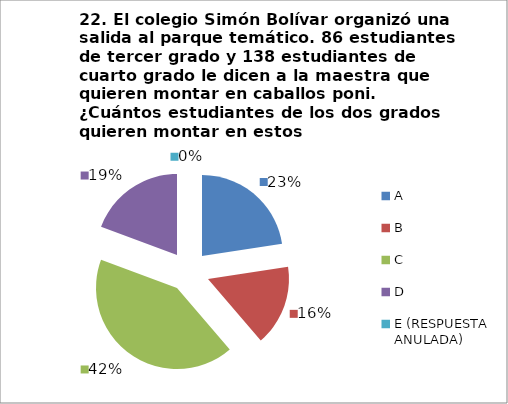
| Category | CANTIDAD DE RESPUESTAS PREGUNTA (22) | PORCENTAJE |
|---|---|---|
| A | 7 | 0.226 |
| B | 5 | 0.161 |
| C | 13 | 0.419 |
| D | 6 | 0.194 |
| E (RESPUESTA ANULADA) | 0 | 0 |